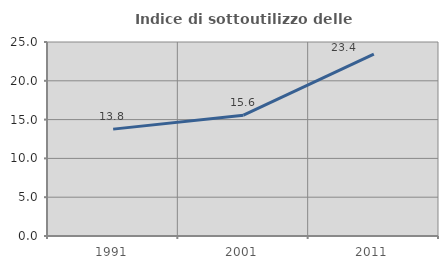
| Category | Indice di sottoutilizzo delle abitazioni  |
|---|---|
| 1991.0 | 13.773 |
| 2001.0 | 15.573 |
| 2011.0 | 23.438 |